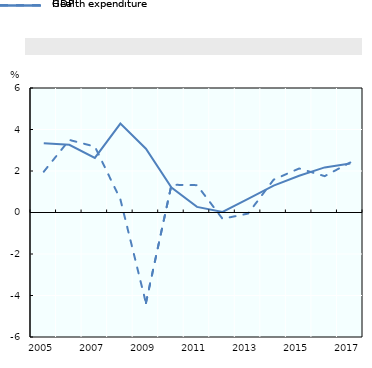
| Category | Health expenditure | GDP |
|---|---|---|
| 2005.0 | 3.339 | 1.967 |
| nan | 3.261 | 3.497 |
| 2007.0 | 2.628 | 3.177 |
| nan | 4.284 | 0.633 |
| 2009.0 | 3.075 | -4.362 |
| nan | 1.203 | 1.336 |
| 2011.0 | 0.27 | 1.318 |
| nan | 0.025 | -0.304 |
| 2013.0 | 0.659 | -0.051 |
| nan | 1.298 | 1.582 |
| 2015.0 | 1.772 | 2.121 |
| nan | 2.173 | 1.752 |
| 2017.0 | 2.362 | 2.412 |